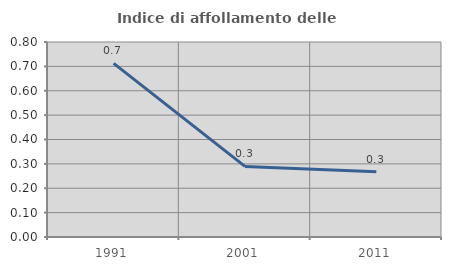
| Category | Indice di affollamento delle abitazioni  |
|---|---|
| 1991.0 | 0.712 |
| 2001.0 | 0.289 |
| 2011.0 | 0.268 |